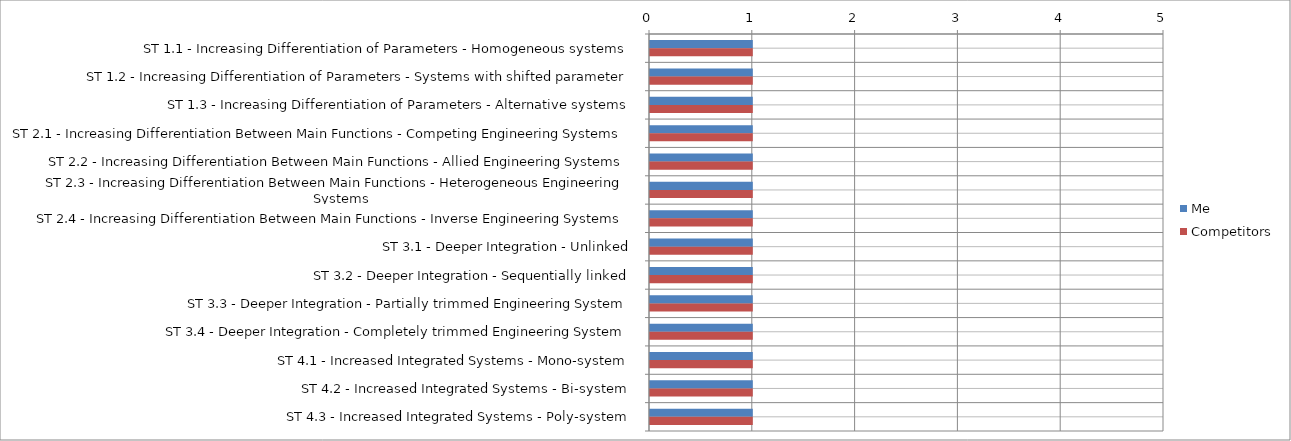
| Category | Me | Competitors |
|---|---|---|
| ST 1.1 - Increasing Differentiation of Parameters - Homogeneous systems | 1 | 1 |
| ST 1.2 - Increasing Differentiation of Parameters - Systems with shifted parameter | 1 | 1 |
| ST 1.3 - Increasing Differentiation of Parameters - Alternative systems | 1 | 1 |
| ST 2.1 - Increasing Differentiation Between Main Functions - Competing Engineering Systems | 1 | 1 |
| ST 2.2 - Increasing Differentiation Between Main Functions - Allied Engineering Systems | 1 | 1 |
| ST 2.3 - Increasing Differentiation Between Main Functions - Heterogeneous Engineering Systems | 1 | 1 |
| ST 2.4 - Increasing Differentiation Between Main Functions - Inverse Engineering Systems | 1 | 1 |
| ST 3.1 - Deeper Integration - Unlinked | 1 | 1 |
| ST 3.2 - Deeper Integration - Sequentially linked | 1 | 1 |
| ST 3.3 - Deeper Integration - Partially trimmed Engineering System | 1 | 1 |
| ST 3.4 - Deeper Integration - Completely trimmed Engineering System | 1 | 1 |
| ST 4.1 - Increased Integrated Systems - Mono-system | 1 | 1 |
| ST 4.2 - Increased Integrated Systems - Bi-system | 1 | 1 |
| ST 4.3 - Increased Integrated Systems - Poly-system | 1 | 1 |